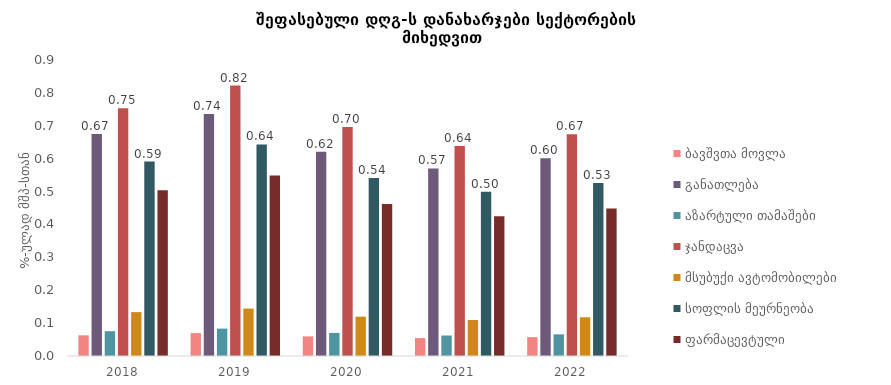
| Category | ბავშვთა მოვლა | განათლება | აზარტული თამაშები | ჯანდაცვა | მსუბუქი ავტომობილები | სოფლის მეურნეობა | ფარმაცევტული |
|---|---|---|---|---|---|---|---|
| 2018.0 | 0.063 | 0.675 | 0.075 | 0.753 | 0.133 | 0.591 | 0.504 |
| 2019.0 | 0.07 | 0.736 | 0.083 | 0.822 | 0.144 | 0.643 | 0.549 |
| 2020.0 | 0.06 | 0.621 | 0.07 | 0.696 | 0.12 | 0.541 | 0.462 |
| 2021.0 | 0.054 | 0.57 | 0.062 | 0.639 | 0.109 | 0.5 | 0.425 |
| 2022.0 | 0.057 | 0.601 | 0.066 | 0.674 | 0.118 | 0.526 | 0.448 |